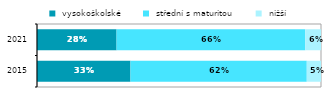
| Category |  vysokoškolské |  střední s maturitou |  nižší  |
|---|---|---|---|
| 2015.0 | 0.329 | 0.621 | 0.05 |
| 2021.0 | 0.28 | 0.664 | 0.056 |